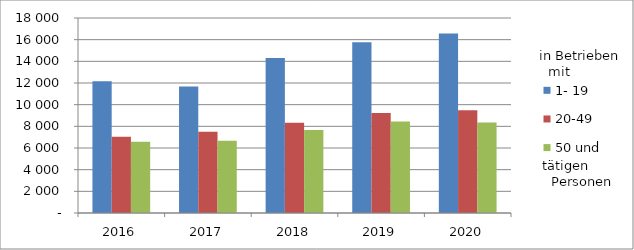
| Category | 1- 19 | 20-49 | 50 und mehr |
|---|---|---|---|
| 2016.0 | 12159 | 7039 | 6566 |
| 2017.0 | 11682 | 7507 | 6671 |
| 2018.0 | 14315 | 8321 | 7663 |
| 2019.0 | 15756 | 9231 | 8442 |
| 2020.0 | 16578 | 9495 | 8365 |